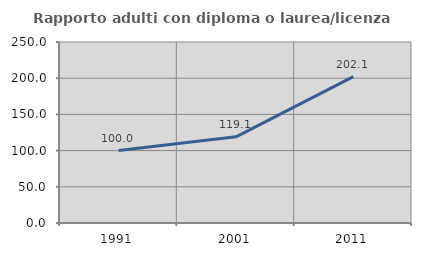
| Category | Rapporto adulti con diploma o laurea/licenza media  |
|---|---|
| 1991.0 | 100 |
| 2001.0 | 119.07 |
| 2011.0 | 202.092 |